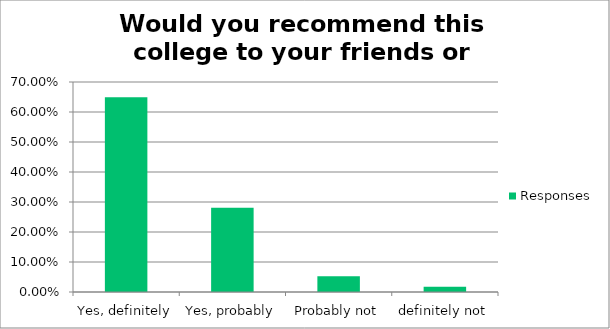
| Category | Responses |
|---|---|
| Yes, definitely | 0.649 |
| Yes, probably | 0.281 |
| Probably not | 0.053 |
| definitely not | 0.018 |